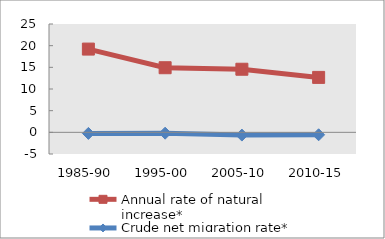
| Category | Annual rate of natural increase* | Crude net migration rate* |
|---|---|---|
| 1985-90 | 19.212 | -0.245 |
| 1995-00 | 14.91 | -0.196 |
| 2005-10 | 14.561 | -0.635 |
| 2010-15 | 12.677 | -0.564 |